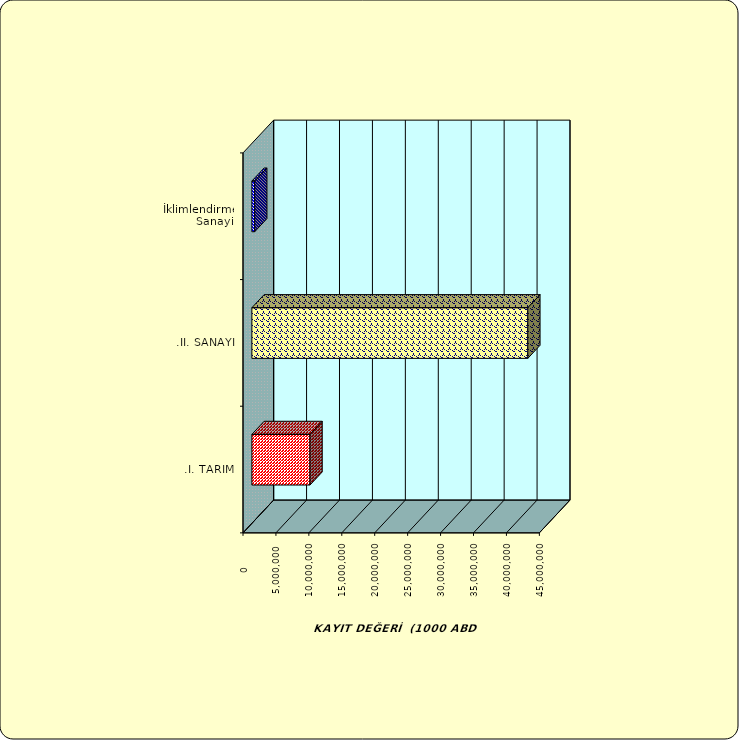
| Category | Series 0 |
|---|---|
| .I. TARIM | 8827533.646 |
| .II. SANAYİ | 41900041.802 |
|  İklimlendirme Sanayii | 430157.14 |